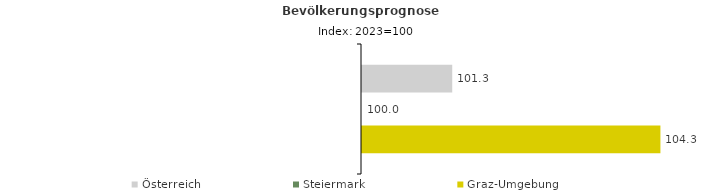
| Category | Österreich | Steiermark | Graz-Umgebung |
|---|---|---|---|
| 2023.0 | 101.3 | 100 | 104.3 |